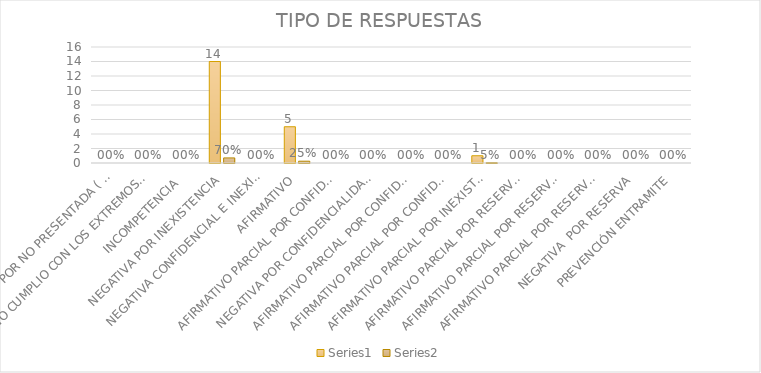
| Category | Series 4 | Series 5 |
|---|---|---|
| SE TIENE POR NO PRESENTADA ( NO CUMPLIÓ PREVENCIÓN) | 0 | 0 |
| NO CUMPLIO CON LOS EXTREMOS DEL ARTÍCULO 79 (REQUISITOS) | 0 | 0 |
| INCOMPETENCIA  | 0 | 0 |
| NEGATIVA POR INEXISTENCIA | 14 | 0.7 |
| NEGATIVA CONFIDENCIAL E INEXISTENTE | 0 | 0 |
| AFIRMATIVO | 5 | 0.25 |
| AFIRMATIVO PARCIAL POR CONFIDENCIALIDAD  | 0 | 0 |
| NEGATIVA POR CONFIDENCIALIDAD Y RESERVADA | 0 | 0 |
| AFIRMATIVO PARCIAL POR CONFIDENCIALIDAD E INEXISTENCIA | 0 | 0 |
| AFIRMATIVO PARCIAL POR CONFIDENCIALIDAD, RESERVA E INEXISTENCIA | 0 | 0 |
| AFIRMATIVO PARCIAL POR INEXISTENCIA | 1 | 0.05 |
| AFIRMATIVO PARCIAL POR RESERVA | 0 | 0 |
| AFIRMATIVO PARCIAL POR RESERVA Y CONFIDENCIALIDAD | 0 | 0 |
| AFIRMATIVO PARCIAL POR RESERVA E INEXISTENCIA | 0 | 0 |
| NEGATIVA  POR RESERVA | 0 | 0 |
| PREVENCIÓN ENTRAMITE | 0 | 0 |